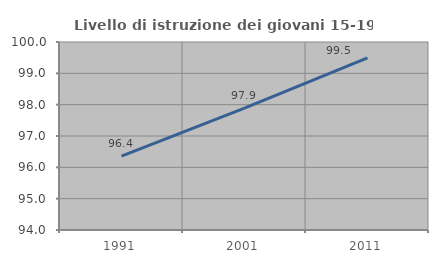
| Category | Livello di istruzione dei giovani 15-19 anni |
|---|---|
| 1991.0 | 96.36 |
| 2001.0 | 97.892 |
| 2011.0 | 99.496 |